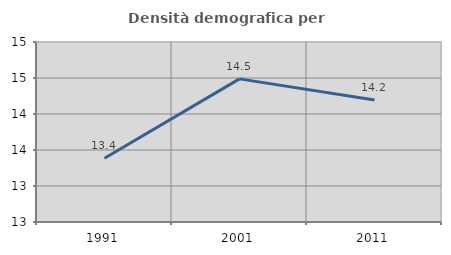
| Category | Densità demografica |
|---|---|
| 1991.0 | 13.385 |
| 2001.0 | 14.488 |
| 2011.0 | 14.193 |